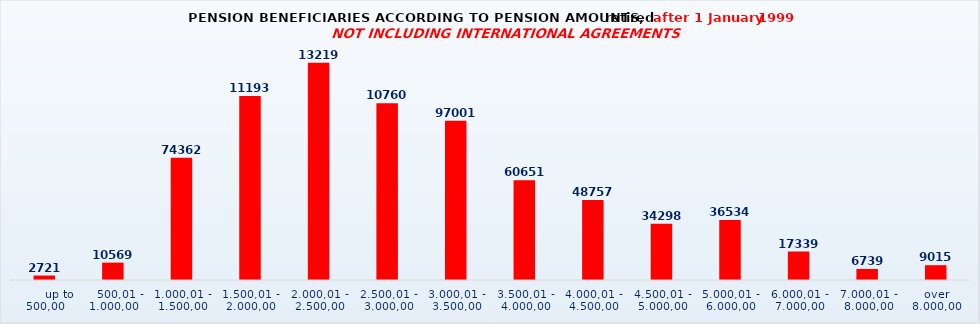
| Category | Series 0 |
|---|---|
|       up to 500,00 | 2721 |
|    500,01 - 1.000,00 | 10569 |
| 1.000,01 - 1.500,00 | 74362 |
| 1.500,01 - 2.000,00 | 111939 |
| 2.000,01 - 2.500,00 | 132197 |
| 2.500,01 - 3.000,00 | 107606 |
| 3.000,01 - 3.500,00 | 97001 |
| 3.500,01 - 4.000,00 | 60651 |
| 4.000,01 - 4.500,00 | 48757 |
| 4.500,01 - 5.000,00 | 34298 |
| 5.000,01 - 6.000,00 | 36534 |
| 6.000,01 - 7.000,00 | 17339 |
| 7.000,01 - 8.000,00 | 6739 |
| over 8.000,00 | 9015 |